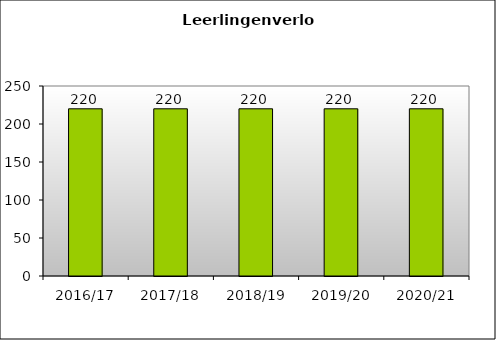
| Category | Series 0 |
|---|---|
| 2016/17 | 220 |
| 2017/18 | 220 |
| 2018/19 | 220 |
| 2019/20 | 220 |
| 2020/21 | 220 |